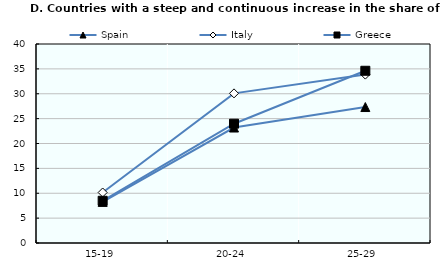
| Category | Spain | Italy | Greece |
|---|---|---|---|
| 15-19 | 8.261 | 10.153 | 8.486 |
| 20-24 | 23.21 | 30.077 | 23.98 |
| 25-29 | 27.328 | 33.85 | 34.62 |